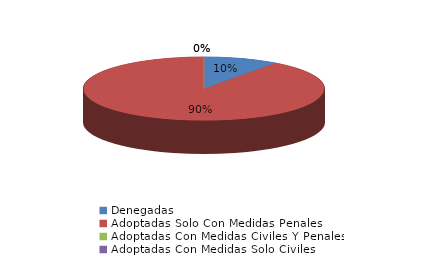
| Category | Series 0 |
|---|---|
| Denegadas | 1 |
| Adoptadas Solo Con Medidas Penales | 9 |
| Adoptadas Con Medidas Civiles Y Penales | 0 |
| Adoptadas Con Medidas Solo Civiles | 0 |